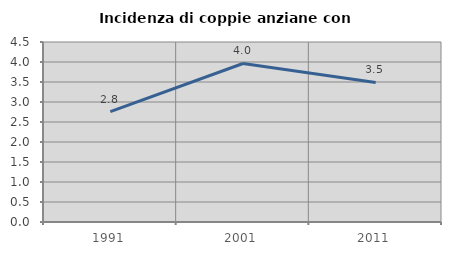
| Category | Incidenza di coppie anziane con figli |
|---|---|
| 1991.0 | 2.758 |
| 2001.0 | 3.963 |
| 2011.0 | 3.489 |